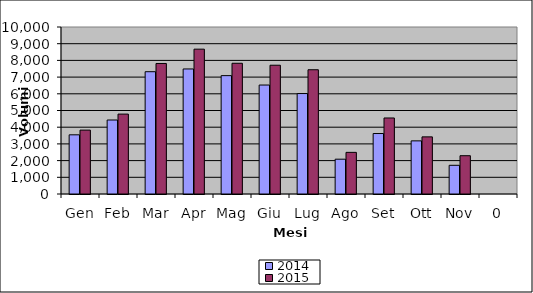
| Category | 2014 | 2015 |
|---|---|---|
| Gen | 3544 | 3825 |
| Feb | 4431 | 4784 |
| Mar | 7323 | 7816 |
| Apr | 7487 | 8673 |
| Mag | 7088 | 7828 |
| Giu | 6525 | 7711 |
| Lug | 6015 | 7441 |
| Ago | 2084 | 2493 |
| Set | 3621 | 4552 |
| Ott | 3182 | 3421 |
| Nov | 1718 | 2293 |
| 0 | 0 | 0 |